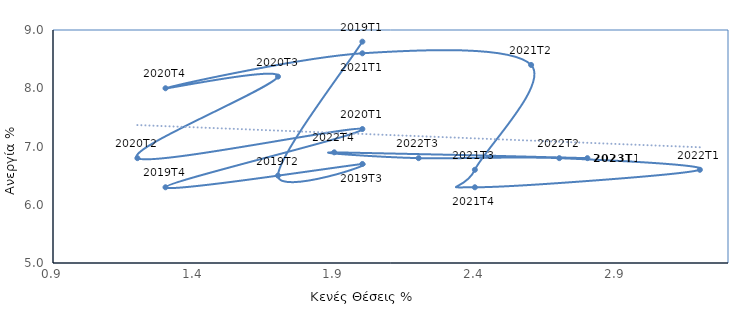
| Category | Ποσοστό κενών θέσεων & Ανεργίας |
|---|---|
| 2.0 | 8.8 |
| 1.7 | 6.5 |
| 2.0 | 6.7 |
| 1.3 | 6.3 |
| 2.0 | 7.3 |
| 1.2 | 6.8 |
| 1.7 | 8.2 |
| 1.3 | 8 |
| 2.0 | 8.6 |
| 2.6 | 8.4 |
| 2.4 | 6.6 |
| 2.4 | 6.3 |
| 3.2 | 6.6 |
| 2.7 | 6.8 |
| 2.2 | 6.8 |
| 1.9 | 6.9 |
| 2.8 | 6.8 |